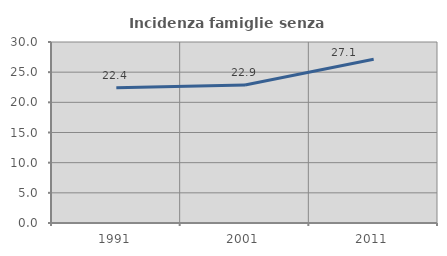
| Category | Incidenza famiglie senza nuclei |
|---|---|
| 1991.0 | 22.406 |
| 2001.0 | 22.86 |
| 2011.0 | 27.136 |